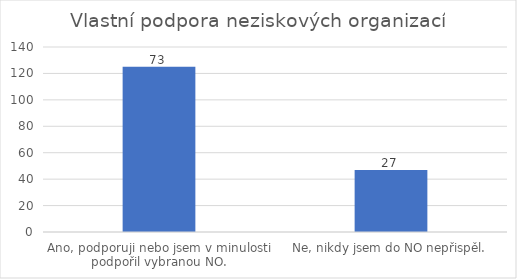
| Category | Počet respondentů |
|---|---|
| Ano, podporuji nebo jsem v minulosti podpořil vybranou NO. | 125 |
| Ne, nikdy jsem do NO nepřispěl. | 47 |